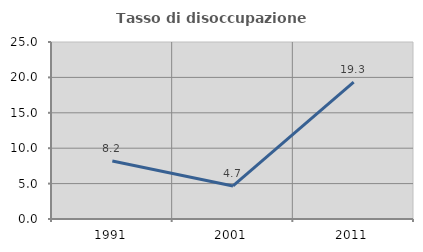
| Category | Tasso di disoccupazione giovanile  |
|---|---|
| 1991.0 | 8.19 |
| 2001.0 | 4.667 |
| 2011.0 | 19.342 |